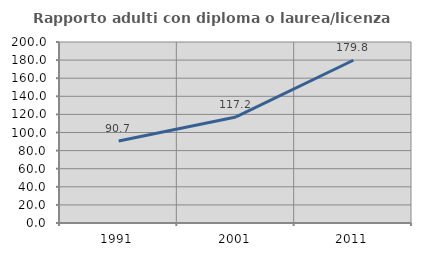
| Category | Rapporto adulti con diploma o laurea/licenza media  |
|---|---|
| 1991.0 | 90.654 |
| 2001.0 | 117.201 |
| 2011.0 | 179.808 |